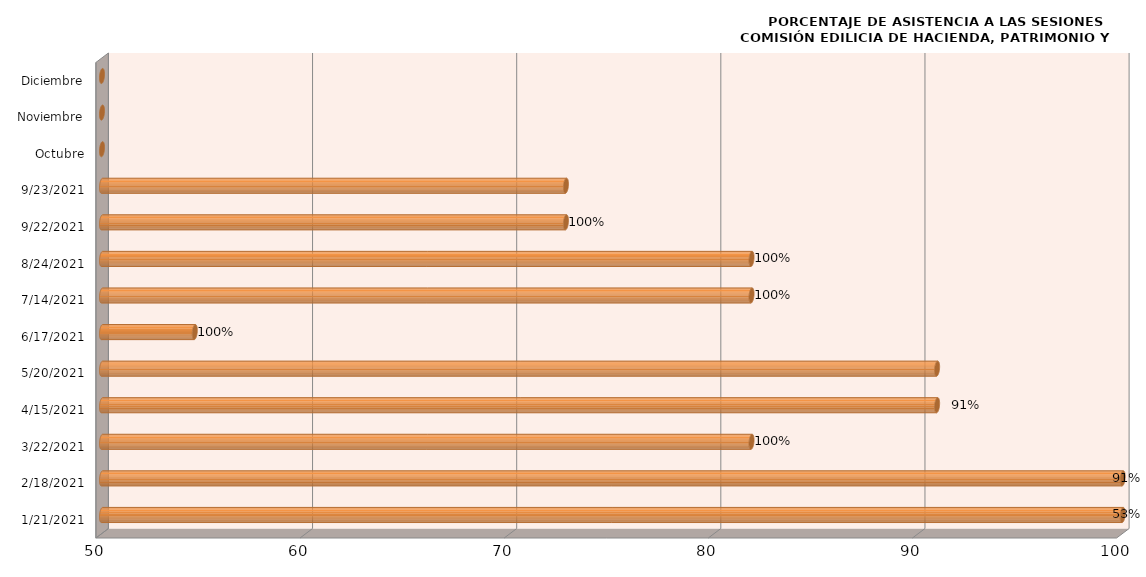
| Category | Series 0 |
|---|---|
| 21/01/2021 | 100 |
| 18/02/2021 | 100 |
| 22/03/2021 | 81.818 |
| 15/04/2021 | 90.909 |
| 20/05/2021 | 90.909 |
| 17/06/2021 | 54.545 |
| 14/07/2021 | 81.818 |
| 24/08/2021 | 81.818 |
| 22/09/2021 | 72.727 |
| 23/09/2021 | 72.727 |
| Octubre | 0 |
| Noviembre | 0 |
| Diciembre | 0 |